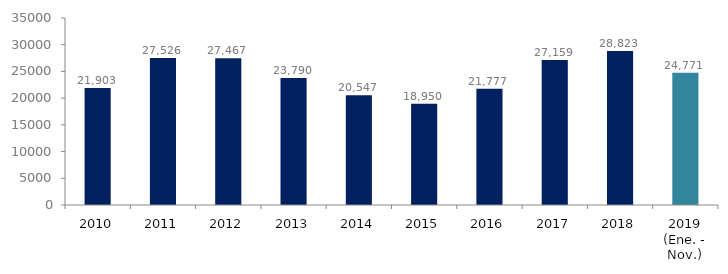
| Category | Series 1 |
|---|---|
| 2010 | 21903 |
| 2011 | 27526 |
| 2012 | 27467 |
| 2013 | 23790 |
| 2014 | 20547 |
| 2015 | 18950.14 |
| 2016 | 21776.636 |
| 2017 | 27158.582 |
| 2018 | 28823.486 |
| 2019 (Ene. - Nov.) | 24770.505 |